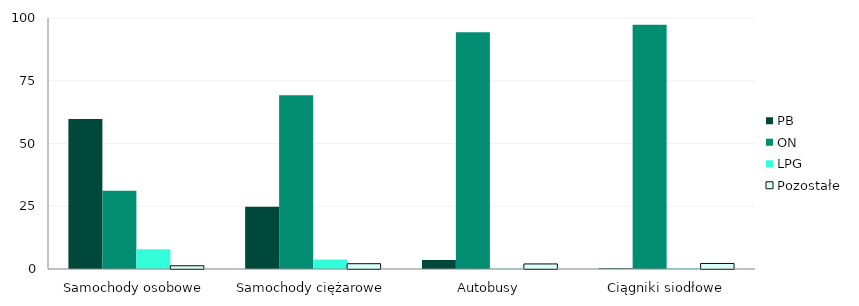
| Category | PB | ON | LPG | Pozostałe |
|---|---|---|---|---|
| 0 | 59.721 | 31.158 | 7.827 | 1.294 |
| 1 | 24.815 | 69.24 | 3.831 | 2.114 |
| 2 | 3.558 | 94.327 | 0.096 | 2.019 |
| 3 | 0.291 | 97.345 | 0.162 | 2.202 |